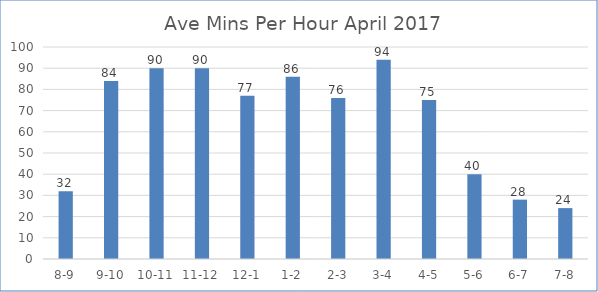
| Category | Ave Mins Per Hour  |
|---|---|
| 8-9 | 32 |
| 9-10 | 84 |
| 10-11 | 90 |
| 11-12 | 90 |
| 12-1 | 77 |
| 1-2 | 86 |
| 2-3 | 76 |
| 3-4 | 94 |
| 4-5 | 75 |
| 5-6 | 40 |
| 6-7 | 28 |
| 7-8 | 24 |